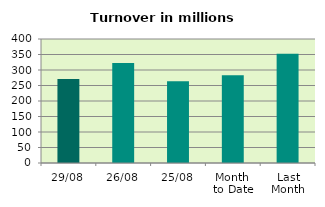
| Category | Series 0 |
|---|---|
| 29/08 | 270.603 |
| 26/08 | 322.398 |
| 25/08 | 263.77 |
| Month 
to Date | 283.085 |
| Last
Month | 352.063 |